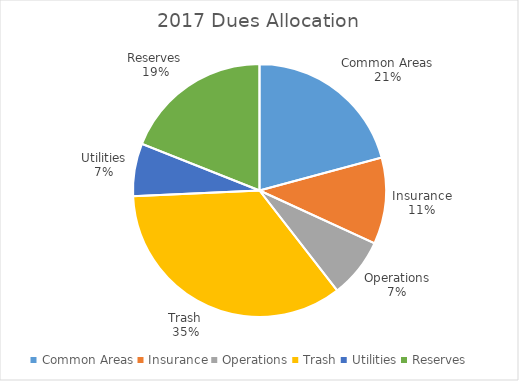
| Category | 2017 Owner |
|---|---|
| Common Areas | 87.674 |
| Insurance | 46.512 |
| Operations | 32.209 |
| Trash | 146.512 |
| Utilities | 28.372 |
| Reserves | 80 |